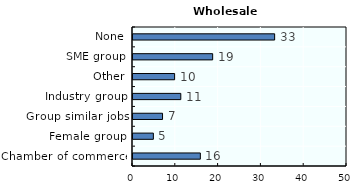
| Category | Wholesale trade |
|---|---|
| Chamber of commerce | 15.737 |
| Female group | 4.759 |
| Group similar jobs | 6.903 |
| Industry group | 11.169 |
| Other | 9.723 |
| SME group | 18.612 |
| None | 33.096 |